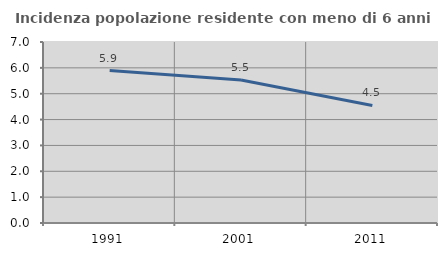
| Category | Incidenza popolazione residente con meno di 6 anni |
|---|---|
| 1991.0 | 5.897 |
| 2001.0 | 5.529 |
| 2011.0 | 4.545 |